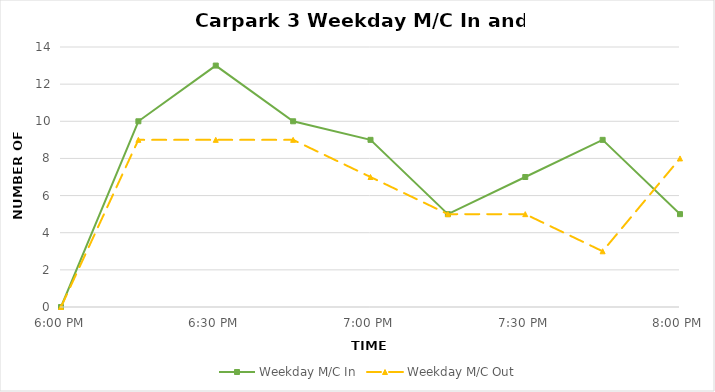
| Category | Weekday M/C In | Weekday M/C Out |
|---|---|---|
| 0.75 | 0 | 0 |
| 0.760416666666667 | 10 | 9 |
| 0.770833333333333 | 13 | 9 |
| 0.78125 | 10 | 9 |
| 0.791666666666667 | 9 | 7 |
| 0.802083333333333 | 5 | 5 |
| 0.8125 | 7 | 5 |
| 0.822916666666667 | 9 | 3 |
| 0.833333333333333 | 5 | 8 |